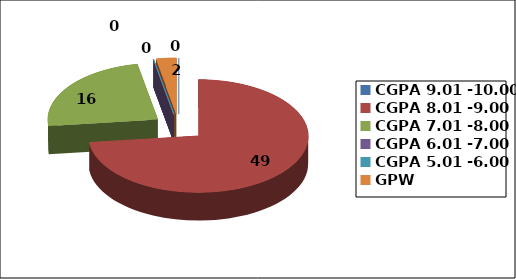
| Category | Series 0 |
|---|---|
| CGPA 9.01 -10.00 | 0 |
| CGPA 8.01 -9.00 | 49 |
| CGPA 7.01 -8.00 | 16 |
| CGPA 6.01 -7.00 | 0 |
| CGPA 5.01 -6.00 | 0 |
| GPW | 2 |